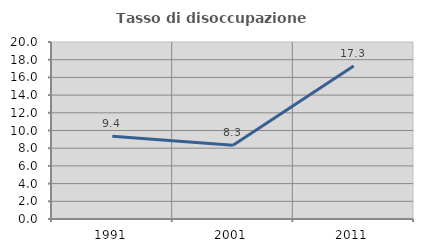
| Category | Tasso di disoccupazione giovanile  |
|---|---|
| 1991.0 | 9.361 |
| 2001.0 | 8.333 |
| 2011.0 | 17.298 |